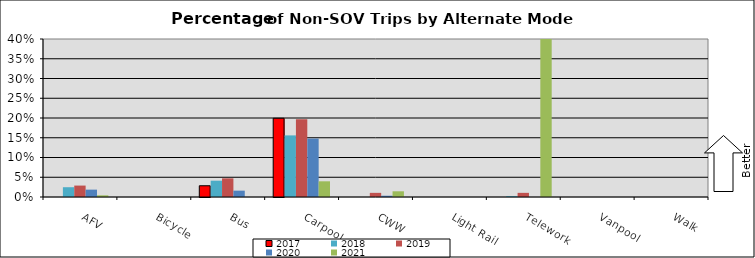
| Category | 2017 | 2018 | 2019 | 2020 | 2021 |
|---|---|---|---|---|---|
| AFV | 0 | 0.025 | 0.029 | 0.019 | 0.004 |
| Bicycle | 0 | 0 | 0 | 0 | 0 |
| Bus | 0.028 | 0.041 | 0.047 | 0.016 | 0 |
| Carpool | 0.199 | 0.156 | 0.197 | 0.148 | 0.04 |
| CWW | 0 | 0 | 0.01 | 0.003 | 0.014 |
| Light Rail | 0 | 0 | 0 | 0 | 0 |
| Telework | 0 | 0.002 | 0.01 | 0 | 0.625 |
| Vanpool | 0 | 0 | 0 | 0 | 0 |
| Walk | 0 | 0 | 0 | 0 | 0 |